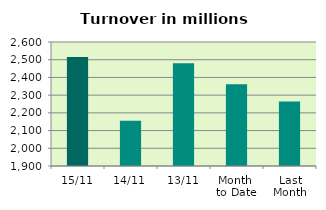
| Category | Series 0 |
|---|---|
| 15/11 | 2515.666 |
| 14/11 | 2156.064 |
| 13/11 | 2479.636 |
| Month 
to Date | 2361.184 |
| Last
Month | 2263.558 |